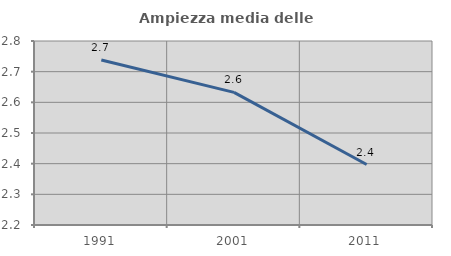
| Category | Ampiezza media delle famiglie |
|---|---|
| 1991.0 | 2.738 |
| 2001.0 | 2.633 |
| 2011.0 | 2.397 |